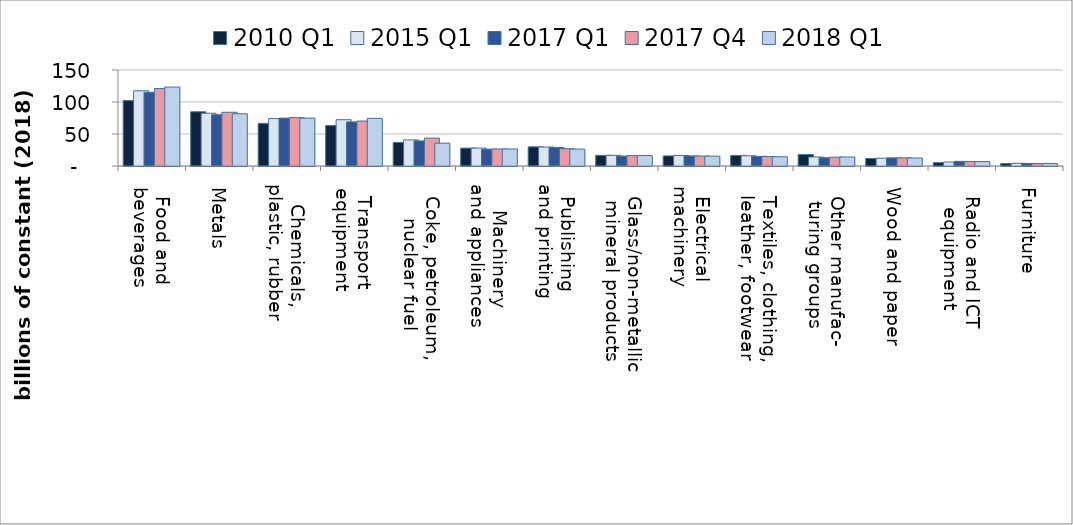
| Category | 2010 Q1 | 2015 Q1 | 2017 Q1 | 2017 Q4 | 2018 Q1 |
|---|---|---|---|---|---|
| Food and 
beverages | 102.246 | 117.524 | 115.174 | 121.05 | 123.401 |
| Metals | 84.741 | 82.43 | 80.119 | 83.97 | 81.659 |
| Chemicals, 
plastic, rubber | 66.596 | 74.078 | 74.827 | 75.575 | 74.827 |
| Transport 
equipment | 63.216 | 72.347 | 68.835 | 70.24 | 74.454 |
| Coke, petroleum, 
nuclear fuel | 36.834 | 40.795 | 39.21 | 43.567 | 35.646 |
| Machinery 
and appliances | 27.946 | 27.946 | 26.318 | 26.589 | 26.589 |
| Publishing 
and printing | 29.92 | 29.627 | 29.04 | 26.987 | 26.4 |
| Glass/non-metallic 
mineral products | 16.694 | 16.694 | 15.549 | 16.203 | 16.367 |
| Electrical 
machinery | 15.744 | 16.436 | 15.744 | 15.571 | 15.398 |
| Textiles, clothing, 
leather, footwear | 16.464 | 15.994 | 15.053 | 14.896 | 14.426 |
| Other manufac-
turing groups | 17.897 | 14.072 | 12.842 | 13.799 | 14.072 |
| Wood and paper | 11.804 | 12.181 | 12.683 | 12.683 | 12.432 |
| Radio and ICT 
equipment | 5.25 | 6.217 | 7.254 | 6.977 | 6.839 |
| Furniture | 3.815 | 4.221 | 4.018 | 3.856 | 3.977 |